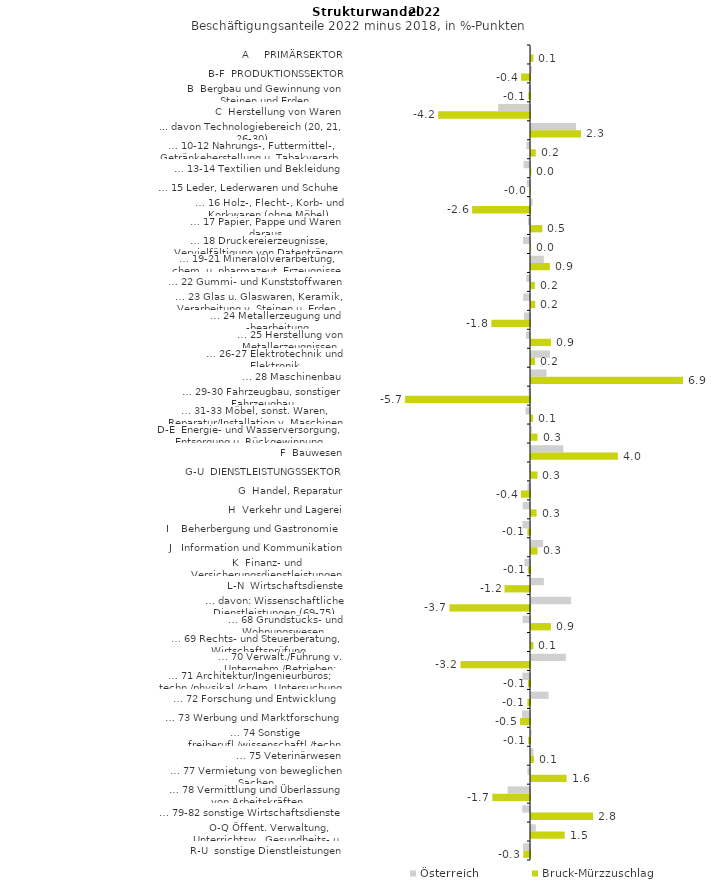
| Category | Österreich | Bruck-Mürzzuschlag |
|---|---|---|
| A     PRIMÄRSEKTOR | 0.004 | 0.111 |
| B-F  PRODUKTIONSSEKTOR | 0.036 | -0.407 |
| B  Bergbau und Gewinnung von Steinen und Erden | -0.063 | -0.08 |
| C  Herstellung von Waren | -1.445 | -4.174 |
| ... davon Technologiebereich (20, 21, 26-30) | 2.047 | 2.273 |
| … 10-12 Nahrungs-, Futtermittel-, Getränkeherstellung u. Tabakverarb. | -0.163 | 0.218 |
| … 13-14 Textilien und Bekleidung | -0.292 | 0.016 |
| … 15 Leder, Lederwaren und Schuhe | -0.15 | -0.007 |
| … 16 Holz-, Flecht-, Korb- und Korkwaren (ohne Möbel)  | 0.068 | -2.63 |
| … 17 Papier, Pappe und Waren daraus  | -0.09 | 0.515 |
| … 18 Druckereierzeugnisse, Vervielfältigung von Datenträgern | -0.314 | 0.005 |
| … 19-21 Mineralölverarbeitung, chem. u. pharmazeut. Erzeugnisse | 0.584 | 0.856 |
| … 22 Gummi- und Kunststoffwaren | -0.168 | 0.178 |
| … 23 Glas u. Glaswaren, Keramik, Verarbeitung v. Steinen u. Erden  | -0.312 | 0.193 |
| … 24 Metallerzeugung und -bearbeitung | -0.276 | -1.755 |
| … 25 Herstellung von Metallerzeugnissen  | -0.185 | 0.909 |
| … 26-27 Elektrotechnik und Elektronik | 0.862 | 0.185 |
| … 28 Maschinenbau | 0.705 | 6.912 |
| … 29-30 Fahrzeugbau, sonstiger Fahrzeugbau | -0.066 | -5.68 |
| … 31-33 Möbel, sonst. Waren, Reparatur/Installation v. Maschinen | -0.204 | 0.093 |
| D-E  Energie- und Wasserversorgung, Entsorgung u. Rückgewinnung | 0.038 | 0.298 |
| F  Bauwesen | 1.469 | 3.95 |
| G-U  DIENSTLEISTUNGSSEKTOR | -0.04 | 0.294 |
| G  Handel, Reparatur | -0.115 | -0.411 |
| H  Verkehr und Lagerei | -0.33 | 0.253 |
| I    Beherbergung und Gastronomie | -0.34 | -0.116 |
| J   Information und Kommunikation | 0.551 | 0.3 |
| K  Finanz- und Versicherungsdienstleistungen | -0.255 | -0.096 |
| L-N  Wirtschaftsdienste | 0.586 | -1.158 |
| … davon: Wissenschaftliche Dienstleistungen (69-75) | 1.815 | -3.663 |
| … 68 Grundstücks- und Wohnungswesen  | -0.331 | 0.904 |
| … 69 Rechts- und Steuerberatung, Wirtschaftsprüfung | 0.008 | 0.109 |
| … 70 Verwalt./Führung v. Unternehm./Betrieben; Unternehmensberat. | 1.583 | -3.16 |
| … 71 Architektur/Ingenieurbüros; techn./physikal./chem. Untersuchung | -0.344 | -0.094 |
| … 72 Forschung und Entwicklung  | 0.797 | -0.12 |
| … 73 Werbung und Marktforschung | -0.361 | -0.451 |
| … 74 Sonstige freiberufl./wissenschaftl./techn. Tätigkeiten | 0.025 | -0.08 |
| … 75 Veterinärwesen | 0.108 | 0.133 |
| … 77 Vermietung von beweglichen Sachen  | -0.116 | 1.619 |
| … 78 Vermittlung und Überlassung von Arbeitskräften | -1.018 | -1.71 |
| … 79-82 sonstige Wirtschaftsdienste | -0.351 | 2.818 |
| O-Q Öffent. Verwaltung, Unterrichtsw., Gesundheits- u. Sozialwesen | 0.216 | 1.532 |
| R-U  sonstige Dienstleistungen | -0.314 | -0.304 |